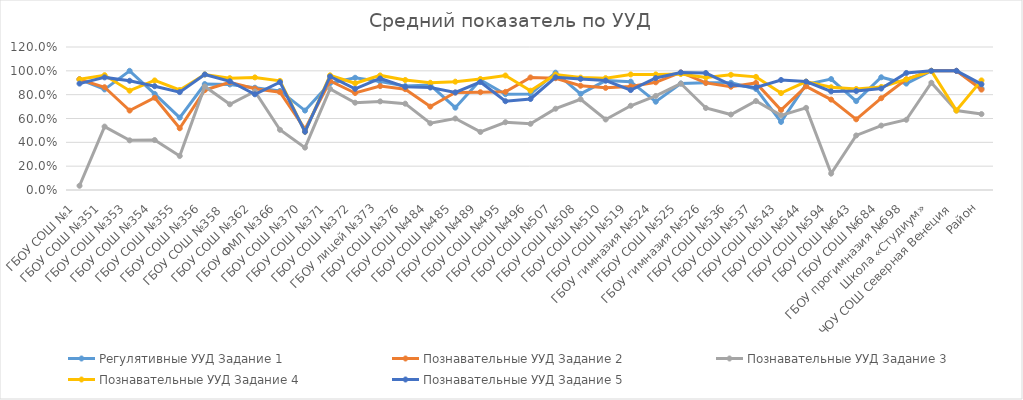
| Category | Регулятивные УУД | Познавательные УУД |
|---|---|---|
| ГБОУ СОШ №1 | 0.929 | 0.893 |
| ГБОУ СОШ №351 | 0.844 | 0.945 |
| ГБОУ СОШ №353 | 1 | 0.917 |
| ГБОУ СОШ №354 | 0.806 | 0.871 |
| ГБОУ СОШ №355 | 0.607 | 0.821 |
| ГБОУ СОШ №356 | 0.889 | 0.97 |
| ГБОУ СОШ №358  | 0.886 | 0.912 |
| ГБОУ СОШ №362 | 0.858 | 0.803 |
| ГБОУ ФМЛ №366 | 0.832 | 0.905 |
| ГБОУ СОШ №370 | 0.667 | 0.489 |
| ГБОУ СОШ №371 | 0.896 | 0.953 |
| ГБОУ СОШ №372 | 0.942 | 0.849 |
| ГБОУ лицей №373 | 0.91 | 0.936 |
| ГБОУ СОШ №376 | 0.872 | 0.865 |
| ГБОУ СОШ №484 | 0.88 | 0.86 |
| ГБОУ СОШ №485 | 0.691 | 0.818 |
| ГБОУ СОШ №489 | 0.923 | 0.906 |
| ГБОУ СОШ №495 | 0.804 | 0.745 |
| ГБОУ СОШ №496 | 0.806 | 0.764 |
| ГБОУ СОШ №507 | 0.984 | 0.946 |
| ГБОУ СОШ №508 | 0.807 | 0.932 |
| ГБОУ СОШ №510 | 0.918 | 0.918 |
| ГБОУ СОШ №519 | 0.909 | 0.838 |
| ГБОУ гимназия №524 | 0.741 | 0.94 |
| ГБОУ СОШ №525 | 0.893 | 0.987 |
| ГБОУ гимназия №526 | 0.899 | 0.982 |
| ГБОУ СОШ №536 | 0.9 | 0.883 |
| ГБОУ СОШ №537 | 0.848 | 0.861 |
| ГБОУ СОШ №543 | 0.571 | 0.923 |
| ГБОУ СОШ №544 | 0.887 | 0.91 |
| ГБОУ СОШ №594 | 0.931 | 0.828 |
| ГБОУ СОШ №643 | 0.746 | 0.831 |
| ГБОУ СОШ №684 | 0.946 | 0.851 |
| ГБОУ прогимназия №698 | 0.893 | 0.982 |
| Школа «Студиум» | 1 | 1 |
| ЧОУ СОШ Северная Венеция | 1 | 1 |
| Район | 0.853 | 0.888 |